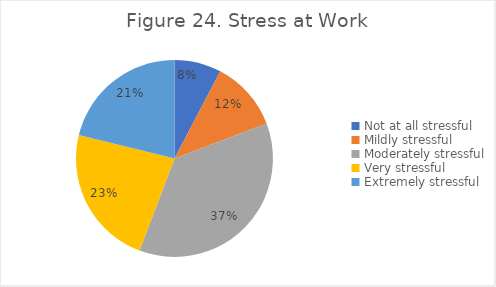
| Category | Series 0 |
|---|---|
| Not at all stressful | 0.077 |
| Mildly stressful | 0.115 |
| Moderately stressful | 0.365 |
| Very stressful | 0.231 |
| Extremely stressful | 0.212 |